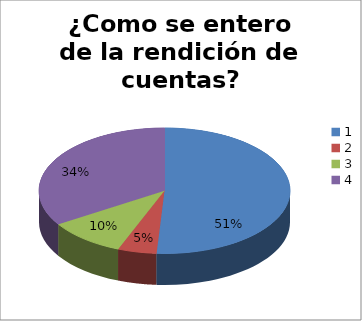
| Category | Series 0 |
|---|---|
| 0 | 51 |
| 1 | 5 |
| 2 | 10 |
| 3 | 34 |